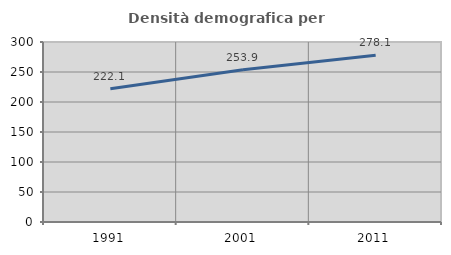
| Category | Densità demografica |
|---|---|
| 1991.0 | 222.132 |
| 2001.0 | 253.91 |
| 2011.0 | 278.055 |